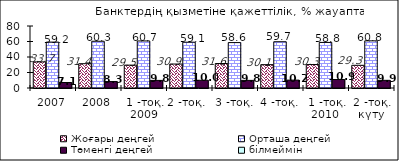
| Category | Жоғары деңгей | Орташа деңгей | Төменгі деңгей |
|---|---|---|---|
| 2007 | 33.68 | 59.228 | 7.092 |
| 2008 | 31.365 | 60.312 | 8.325 |
| 1 -тоқ. 2009 | 29.51 | 60.69 | 9.8 |
| 2 -тоқ.  | 30.91 | 59.09 | 9.99 |
| 3 -тоқ. | 31.58 | 58.59 | 9.83 |
| 4 -тоқ. | 30.14 | 59.7 | 10.17 |
| 1 -тоқ. 2010  | 30.26 | 58.81 | 10.94 |
| 2 -тоқ. күту | 29.28 | 60.83 | 9.89 |